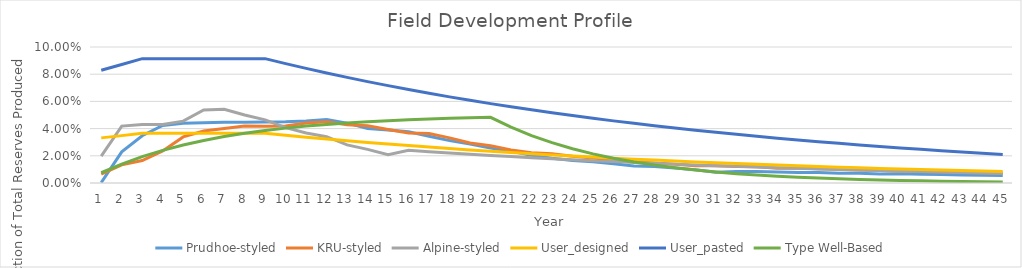
| Category | Prudhoe-styled | KRU-styled | Alpine-styled | User_designed | User_pasted | Type Well-Based |
|---|---|---|---|---|---|---|
| 1.0 | 0 | 0.007 | 0.02 | 0.033 | 0.083 | 0.008 |
| 2.0 | 0.023 | 0.013 | 0.042 | 0.035 | 0.087 | 0.014 |
| 3.0 | 0.035 | 0.017 | 0.043 | 0.037 | 0.091 | 0.019 |
| 4.0 | 0.042 | 0.024 | 0.043 | 0.037 | 0.091 | 0.024 |
| 5.0 | 0.044 | 0.034 | 0.046 | 0.037 | 0.091 | 0.028 |
| 6.0 | 0.044 | 0.038 | 0.054 | 0.037 | 0.091 | 0.031 |
| 7.0 | 0.045 | 0.04 | 0.054 | 0.037 | 0.091 | 0.034 |
| 8.0 | 0.045 | 0.042 | 0.05 | 0.037 | 0.091 | 0.037 |
| 9.0 | 0.045 | 0.042 | 0.046 | 0.037 | 0.091 | 0.039 |
| 10.0 | 0.045 | 0.042 | 0.041 | 0.035 | 0.088 | 0.04 |
| 11.0 | 0.046 | 0.044 | 0.037 | 0.034 | 0.084 | 0.042 |
| 12.0 | 0.047 | 0.045 | 0.034 | 0.032 | 0.081 | 0.043 |
| 13.0 | 0.044 | 0.043 | 0.028 | 0.031 | 0.078 | 0.044 |
| 14.0 | 0.04 | 0.042 | 0.025 | 0.03 | 0.075 | 0.045 |
| 15.0 | 0.039 | 0.039 | 0.021 | 0.029 | 0.072 | 0.046 |
| 16.0 | 0.038 | 0.037 | 0.024 | 0.027 | 0.069 | 0.047 |
| 17.0 | 0.034 | 0.036 | 0.023 | 0.026 | 0.066 | 0.047 |
| 18.0 | 0.031 | 0.033 | 0.022 | 0.025 | 0.063 | 0.048 |
| 19.0 | 0.029 | 0.029 | 0.021 | 0.024 | 0.061 | 0.048 |
| 20.0 | 0.026 | 0.027 | 0.02 | 0.023 | 0.058 | 0.048 |
| 21.0 | 0.023 | 0.024 | 0.019 | 0.022 | 0.056 | 0.041 |
| 22.0 | 0.02 | 0.022 | 0.019 | 0.022 | 0.054 | 0.035 |
| 23.0 | 0.018 | 0.021 | 0.018 | 0.021 | 0.052 | 0.03 |
| 24.0 | 0.017 | 0.02 | 0.017 | 0.02 | 0.05 | 0.025 |
| 25.0 | 0.016 | 0.018 | 0.016 | 0.019 | 0.048 | 0.021 |
| 26.0 | 0.014 | 0.017 | 0.016 | 0.018 | 0.046 | 0.018 |
| 27.0 | 0.012 | 0.016 | 0.015 | 0.018 | 0.044 | 0.015 |
| 28.0 | 0.012 | 0.015 | 0.014 | 0.017 | 0.042 | 0.013 |
| 29.0 | 0.011 | 0.014 | 0.014 | 0.016 | 0.04 | 0.011 |
| 30.0 | 0.01 | 0.013 | 0.013 | 0.016 | 0.039 | 0.01 |
| 31.0 | 0.008 | 0.013 | 0.013 | 0.015 | 0.037 | 0.008 |
| 32.0 | 0.008 | 0.012 | 0.012 | 0.014 | 0.036 | 0.007 |
| 33.0 | 0.008 | 0.012 | 0.012 | 0.014 | 0.034 | 0.006 |
| 34.0 | 0.008 | 0.011 | 0.011 | 0.013 | 0.033 | 0.005 |
| 35.0 | 0.008 | 0.011 | 0.011 | 0.013 | 0.032 | 0.004 |
| 36.0 | 0.008 | 0.01 | 0.01 | 0.012 | 0.03 | 0.004 |
| 37.0 | 0.007 | 0.01 | 0.01 | 0.012 | 0.029 | 0.003 |
| 38.0 | 0.007 | 0.01 | 0.009 | 0.011 | 0.028 | 0.003 |
| 39.0 | 0.007 | 0.009 | 0.009 | 0.011 | 0.027 | 0.002 |
| 40.0 | 0.007 | 0.009 | 0.009 | 0.01 | 0.026 | 0.002 |
| 41.0 | 0.006 | 0.008 | 0.008 | 0.01 | 0.025 | 0.002 |
| 42.0 | 0.006 | 0.008 | 0.008 | 0.01 | 0.024 | 0.001 |
| 43.0 | 0.006 | 0.008 | 0.008 | 0.009 | 0.023 | 0.001 |
| 44.0 | 0.006 | 0.007 | 0.007 | 0.009 | 0.022 | 0.001 |
| 45.0 | 0.005 | 0.007 | 0.007 | 0.008 | 0.021 | 0.001 |